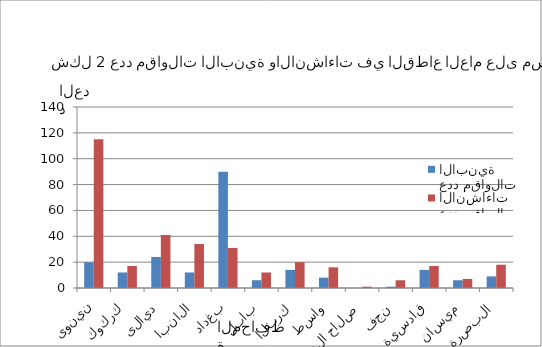
| Category | عدد مقاولات الابنية | عدد مقاولات الانشاءات |
|---|---|---|
| نينوى | 20 | 115 |
| كركوك | 12 | 17 |
| ديالى | 24 | 41 |
| الانبار | 12 | 34 |
| بغداد | 90 | 31 |
| بابل | 6 | 12 |
| كربلاء | 14 | 20 |
| واسط | 8 | 16 |
| صلاح الدين | 0 | 1 |
| نجف | 1 | 6 |
| قادسية | 14 | 17 |
| ميسان | 6 | 7 |
| البصرة | 9 | 18 |